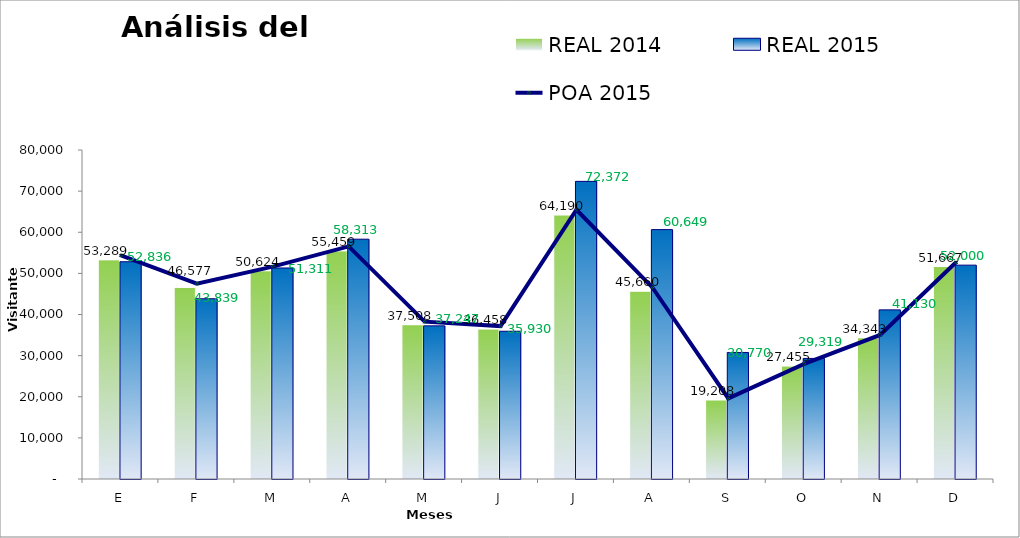
| Category | REAL 2014 | REAL 2015 |
|---|---|---|
| E | 53289 | 52836 |
| F | 46577 | 43839 |
| M | 50624 | 51311 |
| A | 55459 | 58313 |
| M | 37508 | 37247 |
| J | 36458 | 35930 |
| J | 64190 | 72372 |
| A | 45660 | 60649 |
| S | 19208 | 30770 |
| O | 27455 | 29319 |
| N | 34343 | 41130 |
| D | 51667 | 52000 |